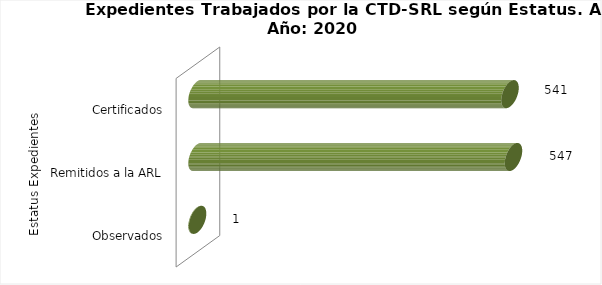
| Category | Total |
|---|---|
| 0 | 1 |
| 1 | 547 |
| 2 | 541 |